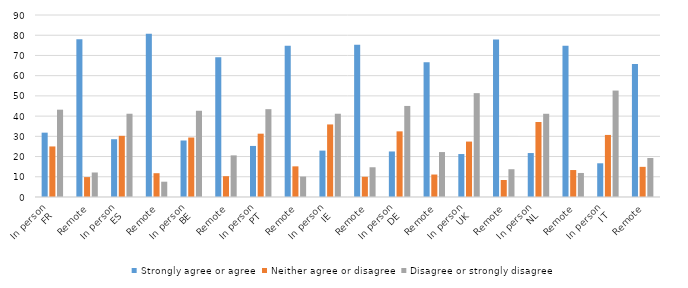
| Category | Strongly agree or agree | Neither agree or disagree | Disagree or strongly disagree |
|---|---|---|---|
| 0 | 31.818 | 25 | 43.182 |
| 1 | 78.03 | 9.848 | 12.121 |
| 2 | 28.571 | 30.252 | 41.176 |
| 3 | 80.672 | 11.765 | 7.563 |
| 4 | 27.941 | 29.412 | 42.647 |
| 5 | 69.118 | 10.294 | 20.588 |
| 6 | 25.253 | 31.313 | 43.434 |
| 7 | 74.747 | 15.152 | 10.101 |
| 8 | 22.941 | 35.882 | 41.176 |
| 9 | 75.294 | 10 | 14.706 |
| 10 | 22.515 | 32.456 | 45.029 |
| 11 | 66.667 | 11.111 | 22.222 |
| 12 | 21.242 | 27.408 | 51.35 |
| 13 | 77.858 | 8.416 | 13.726 |
| 14 | 21.739 | 37.101 | 41.159 |
| 15 | 74.783 | 13.333 | 11.884 |
| 16 | 16.667 | 30.702 | 52.632 |
| 17 | 65.789 | 14.912 | 19.298 |